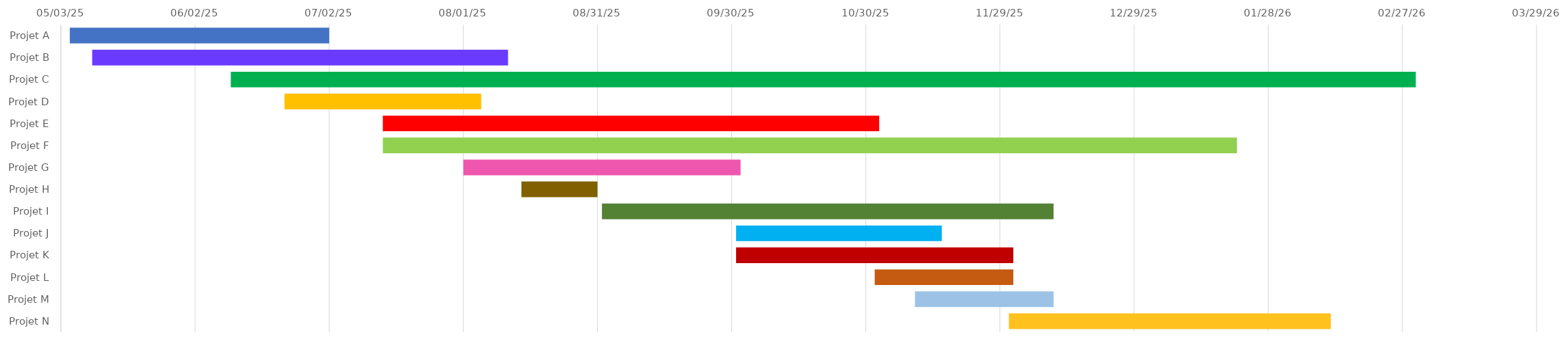
| Category | DATE DE 
DÉBUT | Durée |
|---|---|---|
| Projet A | 2025-05-05 | 58 |
| Projet B | 2025-05-10 | 93 |
| Projet C | 2025-06-10 | 265 |
| Projet D | 2025-06-22 | 44 |
| Projet E | 2025-07-14 | 111 |
| Projet F | 2025-07-14 | 191 |
| Projet G | 2025-08-01 | 62 |
| Projet H | 2025-08-14 | 17 |
| Projet I | 2025-09-01 | 101 |
| Projet J | 2025-10-01 | 46 |
| Projet K | 2025-10-01 | 62 |
| Projet L | 2025-11-01 | 31 |
| Projet M | 2025-11-10 | 31 |
| Projet N | 2025-12-01 | 72 |